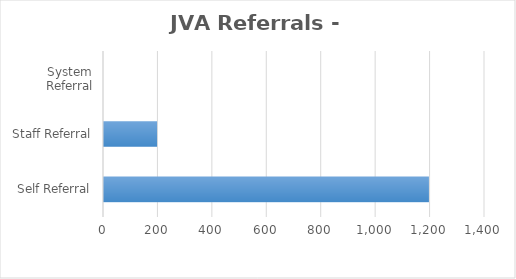
| Category | Series 0 |
|---|---|
| Self Referral | 1194 |
| Staff Referral | 195 |
| System Referral | 0 |